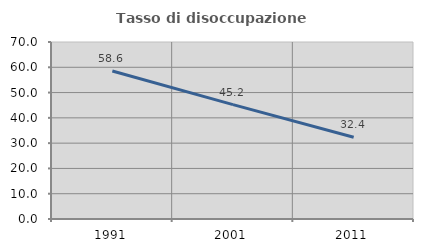
| Category | Tasso di disoccupazione giovanile  |
|---|---|
| 1991.0 | 58.559 |
| 2001.0 | 45.238 |
| 2011.0 | 32.353 |